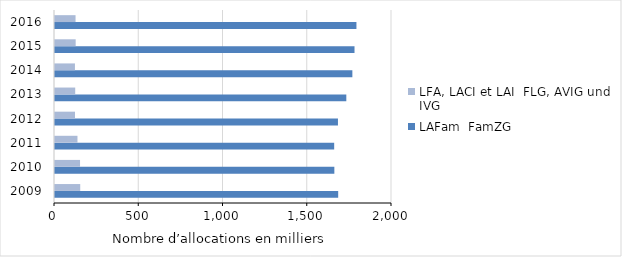
| Category | LAFam | LFA, LACI et LAI |
|---|---|---|
| 2009.0 | 1680.642 | 149.688 |
| 2010.0 | 1657.872 | 148.562 |
| 2011.0 | 1656.872 | 133.334 |
| 2012.0 | 1679.266 | 118.763 |
| 2013.0 | 1728.866 | 119.988 |
| 2014.0 | 1764.77 | 118.35 |
| 2015.0 | 1777.524 | 122.69 |
| 2016.0 | 1788.951 | 121.94 |